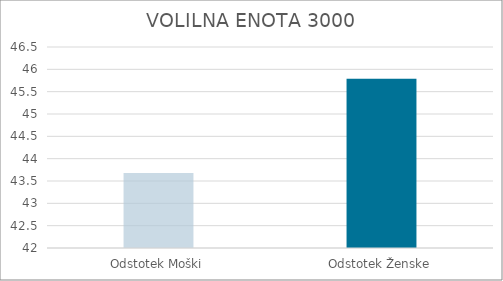
| Category | Series 0 |
|---|---|
| Odstotek Moški | 43.68 |
| Odstotek Ženske | 45.79 |